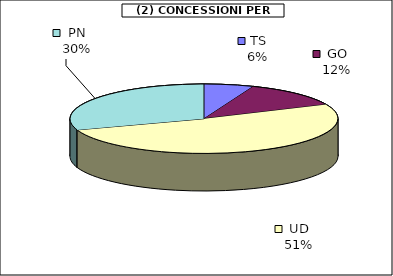
| Category | Series 0 |
|---|---|
| TS | 5700 |
| GO | 11700 |
| UD | 48943.5 |
| PN | 28717.5 |